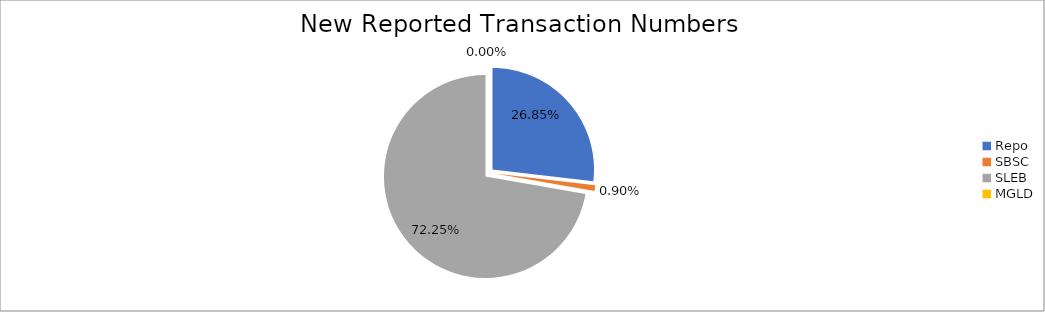
| Category | Series 0 |
|---|---|
| Repo | 297284 |
| SBSC | 9979 |
| SLEB | 799947 |
| MGLD | 16 |